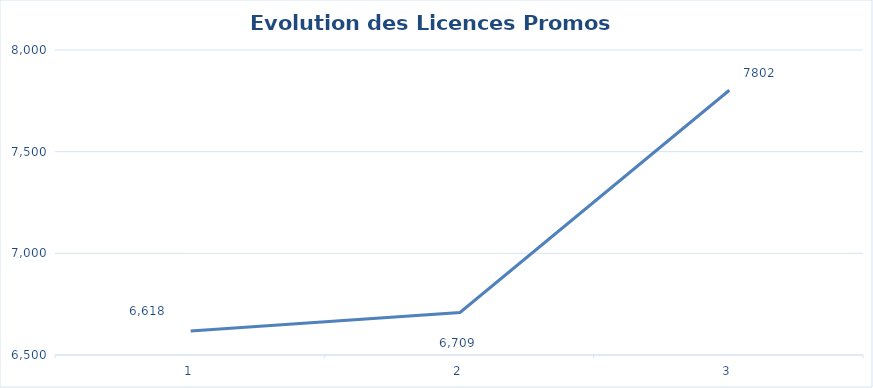
| Category | AURA PROMOS |
|---|---|
| 0 | 6618 |
| 1 | 6709 |
| 2 | 7802 |